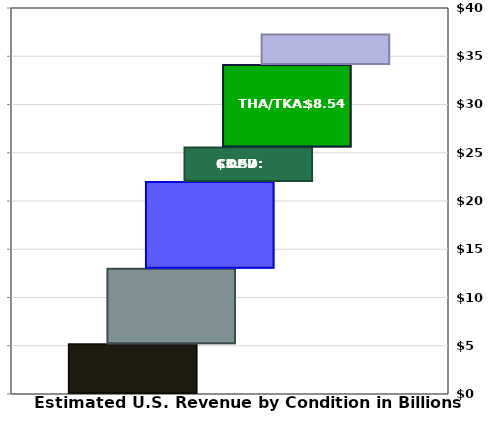
| Category | Series 0 | Series 1 | Series 2 | Series 3 | Series 4 | Series 5 |
|---|---|---|---|---|---|---|
| 0 | 5144229500 | 7826598600 | 8994895200 | 3570878800 | 8544617800 | 3170582100 |